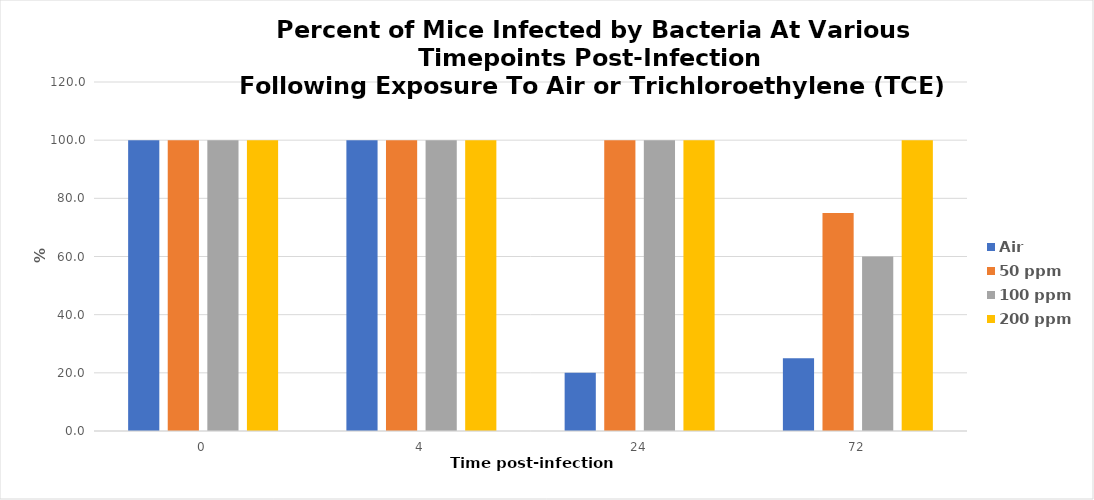
| Category | Air | 50 ppm | 100 ppm | 200 ppm |
|---|---|---|---|---|
| 0.0 | 100 | 100 | 100 | 100 |
| 4.0 | 100 | 100 | 100 | 100 |
| 24.0 | 20 | 100 | 100 | 100 |
| 72.0 | 25 | 75 | 60 | 100 |